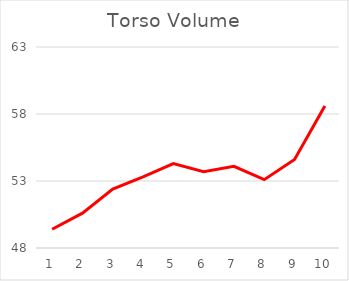
| Category | Series 0 |
|---|---|
| 0 | 49.4 |
| 1 | 50.6 |
| 2 | 52.4 |
| 3 | 53.3 |
| 4 | 54.3 |
| 5 | 53.7 |
| 6 | 54.1 |
| 7 | 53.1 |
| 8 | 54.6 |
| 9 | 58.6 |